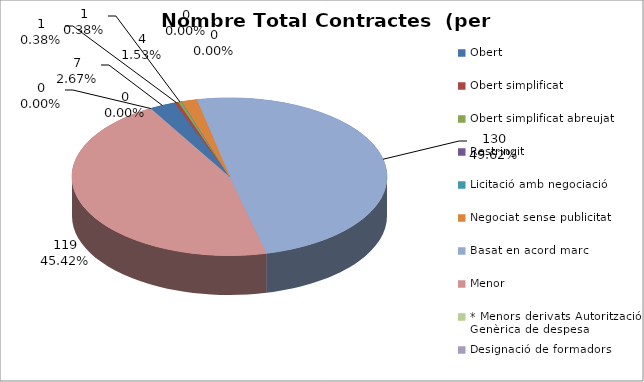
| Category | Nombre Total Contractes |
|---|---|
| Obert | 7 |
| Obert simplificat | 1 |
| Obert simplificat abreujat | 1 |
| Restringit | 0 |
| Licitació amb negociació | 0 |
| Negociat sense publicitat | 4 |
| Basat en acord marc | 130 |
| Menor | 119 |
| * Menors derivats Autorització Genèrica de despesa | 0 |
| Designació de formadors | 0 |